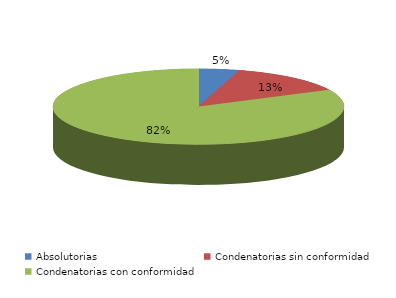
| Category | Series 0 |
|---|---|
| Absolutorias | 10 |
| Condenatorias sin conformidad | 29 |
| Condenatorias con conformidad | 182 |